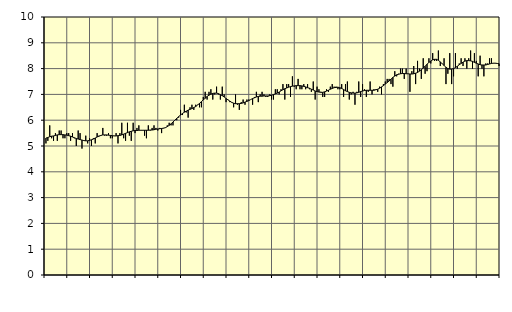
| Category | Byggverksamhet, SNI 41-43 | Series 1 |
|---|---|---|
| nan | 5.1 | 5.31 |
| 1.0 | 5.2 | 5.33 |
| 1.0 | 5.8 | 5.36 |
| 1.0 | 5.3 | 5.38 |
| 1.0 | 5.2 | 5.39 |
| 1.0 | 5.5 | 5.41 |
| 1.0 | 5.2 | 5.43 |
| 1.0 | 5.6 | 5.44 |
| 1.0 | 5.6 | 5.44 |
| 1.0 | 5.3 | 5.44 |
| 1.0 | 5.3 | 5.43 |
| 1.0 | 5.5 | 5.42 |
| nan | 5.5 | 5.4 |
| 2.0 | 5.2 | 5.38 |
| 2.0 | 5.5 | 5.35 |
| 2.0 | 5.3 | 5.32 |
| 2.0 | 5 | 5.29 |
| 2.0 | 5.6 | 5.27 |
| 2.0 | 5.5 | 5.25 |
| 2.0 | 4.9 | 5.23 |
| 2.0 | 5.2 | 5.21 |
| 2.0 | 5.4 | 5.2 |
| 2.0 | 5.1 | 5.2 |
| 2.0 | 5.3 | 5.22 |
| nan | 5 | 5.24 |
| 3.0 | 5.3 | 5.27 |
| 3.0 | 5.1 | 5.31 |
| 3.0 | 5.5 | 5.35 |
| 3.0 | 5.4 | 5.38 |
| 3.0 | 5.4 | 5.41 |
| 3.0 | 5.7 | 5.43 |
| 3.0 | 5.4 | 5.43 |
| 3.0 | 5.4 | 5.43 |
| 3.0 | 5.5 | 5.42 |
| 3.0 | 5.3 | 5.41 |
| 3.0 | 5.3 | 5.4 |
| nan | 5.4 | 5.39 |
| 4.0 | 5.5 | 5.39 |
| 4.0 | 5.1 | 5.4 |
| 4.0 | 5.5 | 5.41 |
| 4.0 | 5.9 | 5.43 |
| 4.0 | 5.3 | 5.46 |
| 4.0 | 5.2 | 5.49 |
| 4.0 | 5.9 | 5.52 |
| 4.0 | 5.4 | 5.55 |
| 4.0 | 5.2 | 5.57 |
| 4.0 | 5.9 | 5.59 |
| 4.0 | 5.5 | 5.6 |
| nan | 5.7 | 5.6 |
| 5.0 | 5.8 | 5.61 |
| 5.0 | 5.6 | 5.61 |
| 5.0 | 5.6 | 5.61 |
| 5.0 | 5.4 | 5.61 |
| 5.0 | 5.3 | 5.61 |
| 5.0 | 5.8 | 5.61 |
| 5.0 | 5.6 | 5.62 |
| 5.0 | 5.7 | 5.62 |
| 5.0 | 5.8 | 5.63 |
| 5.0 | 5.7 | 5.65 |
| 5.0 | 5.6 | 5.66 |
| nan | 5.7 | 5.67 |
| 6.0 | 5.5 | 5.68 |
| 6.0 | 5.7 | 5.69 |
| 6.0 | 5.7 | 5.71 |
| 6.0 | 5.8 | 5.75 |
| 6.0 | 5.9 | 5.8 |
| 6.0 | 5.8 | 5.86 |
| 6.0 | 5.8 | 5.93 |
| 6.0 | 6 | 6 |
| 6.0 | 6 | 6.07 |
| 6.0 | 6.1 | 6.14 |
| 6.0 | 6.4 | 6.2 |
| nan | 6.2 | 6.26 |
| 7.0 | 6.6 | 6.31 |
| 7.0 | 6.3 | 6.35 |
| 7.0 | 6.1 | 6.39 |
| 7.0 | 6.5 | 6.42 |
| 7.0 | 6.6 | 6.45 |
| 7.0 | 6.4 | 6.49 |
| 7.0 | 6.6 | 6.53 |
| 7.0 | 6.6 | 6.59 |
| 7.0 | 6.5 | 6.65 |
| 7.0 | 6.5 | 6.72 |
| 7.0 | 6.9 | 6.79 |
| nan | 7.1 | 6.85 |
| 8.0 | 6.8 | 6.92 |
| 8.0 | 7.1 | 6.97 |
| 8.0 | 7.2 | 7.01 |
| 8.0 | 6.8 | 7.04 |
| 8.0 | 7 | 7.05 |
| 8.0 | 7.3 | 7.05 |
| 8.0 | 7 | 7.03 |
| 8.0 | 6.8 | 6.99 |
| 8.0 | 7.3 | 6.95 |
| 8.0 | 7 | 6.9 |
| 8.0 | 6.7 | 6.84 |
| nan | 6.8 | 6.79 |
| 9.0 | 6.7 | 6.74 |
| 9.0 | 6.7 | 6.69 |
| 9.0 | 6.5 | 6.66 |
| 9.0 | 7 | 6.64 |
| 9.0 | 6.6 | 6.64 |
| 9.0 | 6.4 | 6.64 |
| 9.0 | 6.7 | 6.65 |
| 9.0 | 6.8 | 6.67 |
| 9.0 | 6.6 | 6.7 |
| 9.0 | 6.8 | 6.73 |
| 9.0 | 6.8 | 6.76 |
| nan | 6.8 | 6.8 |
| 10.0 | 6.6 | 6.84 |
| 10.0 | 6.9 | 6.87 |
| 10.0 | 7.1 | 6.9 |
| 10.0 | 6.7 | 6.92 |
| 10.0 | 7 | 6.93 |
| 10.0 | 7.1 | 6.93 |
| 10.0 | 7 | 6.94 |
| 10.0 | 6.9 | 6.94 |
| 10.0 | 6.9 | 6.94 |
| 10.0 | 7 | 6.95 |
| 10.0 | 6.8 | 6.97 |
| nan | 6.8 | 6.99 |
| 11.0 | 7.2 | 7.02 |
| 11.0 | 7.2 | 7.05 |
| 11.0 | 7 | 7.09 |
| 11.0 | 7.2 | 7.14 |
| 11.0 | 7.4 | 7.18 |
| 11.0 | 6.8 | 7.22 |
| 11.0 | 7.4 | 7.25 |
| 11.0 | 7.4 | 7.28 |
| 11.0 | 6.9 | 7.3 |
| 11.0 | 7.7 | 7.32 |
| 11.0 | 7.3 | 7.33 |
| nan | 7.2 | 7.34 |
| 12.0 | 7.6 | 7.34 |
| 12.0 | 7.2 | 7.34 |
| 12.0 | 7.2 | 7.33 |
| 12.0 | 7.4 | 7.31 |
| 12.0 | 7.2 | 7.29 |
| 12.0 | 7.4 | 7.26 |
| 12.0 | 7.2 | 7.24 |
| 12.0 | 7.1 | 7.2 |
| 12.0 | 7.5 | 7.17 |
| 12.0 | 6.8 | 7.13 |
| 12.0 | 7.3 | 7.11 |
| nan | 7.2 | 7.09 |
| 13.0 | 7.1 | 7.08 |
| 13.0 | 6.9 | 7.08 |
| 13.0 | 6.9 | 7.1 |
| 13.0 | 7.2 | 7.13 |
| 13.0 | 7.1 | 7.16 |
| 13.0 | 7.3 | 7.2 |
| 13.0 | 7.4 | 7.23 |
| 13.0 | 7.3 | 7.26 |
| 13.0 | 7.3 | 7.27 |
| 13.0 | 7.2 | 7.28 |
| 13.0 | 7.2 | 7.26 |
| nan | 7.4 | 7.23 |
| 14.0 | 6.9 | 7.19 |
| 14.0 | 7.4 | 7.14 |
| 14.0 | 7.5 | 7.11 |
| 14.0 | 6.8 | 7.08 |
| 14.0 | 7 | 7.06 |
| 14.0 | 7.1 | 7.05 |
| 14.0 | 6.6 | 7.05 |
| 14.0 | 7.1 | 7.06 |
| 14.0 | 7.5 | 7.08 |
| 14.0 | 6.9 | 7.11 |
| 14.0 | 7.4 | 7.13 |
| nan | 7.2 | 7.15 |
| 15.0 | 6.9 | 7.16 |
| 15.0 | 7.1 | 7.16 |
| 15.0 | 7.5 | 7.16 |
| 15.0 | 7 | 7.16 |
| 15.0 | 7.2 | 7.16 |
| 15.0 | 7.2 | 7.18 |
| 15.0 | 7.1 | 7.2 |
| 15.0 | 7.3 | 7.24 |
| 15.0 | 7 | 7.29 |
| 15.0 | 7.4 | 7.34 |
| 15.0 | 7.5 | 7.4 |
| nan | 7.6 | 7.46 |
| 16.0 | 7.6 | 7.52 |
| 16.0 | 7.4 | 7.59 |
| 16.0 | 7.3 | 7.66 |
| 16.0 | 7.9 | 7.71 |
| 16.0 | 7.7 | 7.76 |
| 16.0 | 7.8 | 7.78 |
| 16.0 | 8 | 7.8 |
| 16.0 | 8 | 7.81 |
| 16.0 | 7.6 | 7.81 |
| 16.0 | 8 | 7.8 |
| 16.0 | 7.8 | 7.8 |
| nan | 7.1 | 7.79 |
| 17.0 | 7.9 | 7.79 |
| 17.0 | 8.1 | 7.8 |
| 17.0 | 7.4 | 7.82 |
| 17.0 | 8.3 | 7.85 |
| 17.0 | 8 | 7.9 |
| 17.0 | 7.6 | 7.96 |
| 17.0 | 8.4 | 8.02 |
| 17.0 | 7.8 | 8.09 |
| 17.0 | 7.9 | 8.17 |
| 17.0 | 8.4 | 8.24 |
| 17.0 | 8.2 | 8.29 |
| nan | 8.6 | 8.34 |
| 18.0 | 8.3 | 8.36 |
| 18.0 | 8.3 | 8.36 |
| 18.0 | 8.7 | 8.32 |
| 18.0 | 8.1 | 8.26 |
| 18.0 | 8.2 | 8.19 |
| 18.0 | 8.4 | 8.12 |
| 18.0 | 7.4 | 8.05 |
| 18.0 | 7.8 | 8 |
| 18.0 | 8.6 | 7.98 |
| 18.0 | 7.4 | 7.98 |
| 18.0 | 7.7 | 8 |
| nan | 8.6 | 8.04 |
| 19.0 | 8 | 8.09 |
| 19.0 | 8.2 | 8.15 |
| 19.0 | 8.4 | 8.2 |
| 19.0 | 8.1 | 8.25 |
| 19.0 | 8.4 | 8.29 |
| 19.0 | 8 | 8.31 |
| 19.0 | 8.4 | 8.31 |
| 19.0 | 8.7 | 8.3 |
| 19.0 | 8 | 8.28 |
| 19.0 | 8.6 | 8.24 |
| 19.0 | 8.3 | 8.21 |
| nan | 7.7 | 8.18 |
| 20.0 | 8.5 | 8.15 |
| 20.0 | 8 | 8.14 |
| 20.0 | 7.7 | 8.14 |
| 20.0 | 8.2 | 8.14 |
| 20.0 | 8.2 | 8.16 |
| 20.0 | 8.4 | 8.18 |
| 20.0 | 8.4 | 8.2 |
| 20.0 | 8.2 | 8.21 |
| 20.0 | 8.2 | 8.21 |
| 20.0 | 8.2 | 8.2 |
| 20.0 | 8.1 | 8.19 |